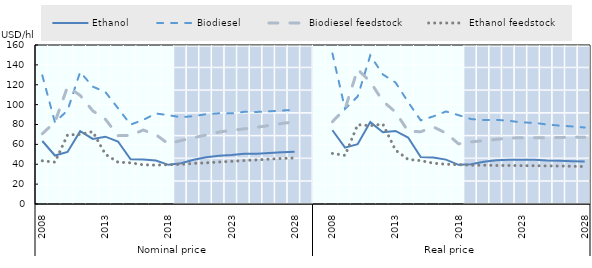
| Category | Projected1 | Projected2 | Projected3 | Projected4 | Projected5 | Projected6 | Projected7 |
|---|---|---|---|---|---|---|---|
| 0 | 0 | 0 | 0 | 0 | 0 | 0 | 0 |
| 1 | 0 | 0 | 0 | 0 | 0 | 0 | 0 |
| 2 | 0 | 0 | 0 | 0 | 0 | 0 | 0 |
| 3 | 0 | 0 | 0 | 0 | 0 | 0 | 0 |
| 4 | 0 | 0 | 0 | 0 | 0 | 0 | 0 |
| 5 | 0 | 0 | 0 | 0 | 0 | 0 | 0 |
| 6 | 0 | 0 | 0 | 0 | 0 | 0 | 0 |
| 7 | 0 | 0 | 0 | 0 | 0 | 0 | 0 |
| 8 | 0 | 0 | 0 | 0 | 0 | 0 | 0 |
| 9 | 0 | 0 | 0 | 0 | 0 | 0 | 0 |
| 10 | 0 | 0 | 0 | 0 | 0 | 0 | 0 |
| 11 | 1 | 1 | 1 | 1 | 1 | 1 | 0.95 |
| 12 | 1 | 1 | 1 | 1 | 1 | 1 | 0.95 |
| 13 | 1 | 1 | 1 | 1 | 1 | 1 | 0.95 |
| 14 | 1 | 1 | 1 | 1 | 1 | 1 | 0.95 |
| 15 | 1 | 1 | 1 | 1 | 1 | 1 | 0.95 |
| 16 | 1 | 1 | 1 | 1 | 1 | 1 | 0.95 |
| 17 | 1 | 1 | 1 | 1 | 1 | 1 | 0.95 |
| 18 | 1 | 1 | 1 | 1 | 1 | 1 | 0.95 |
| 19 | 1 | 1 | 1 | 1 | 1 | 1 | 0.95 |
| 20 | 1 | 1 | 1 | 1 | 1 | 1 | 0.95 |
| 21 | 1 | 1 | 1 | 1 | 1 | 1 | 0.95 |
| 22 | 0 | 0 | 0 | 0 | 0 | 0 | 0 |
| 23 | 0 | 0 | 0 | 0 | 0 | 0 | 0 |
| 24 | 0 | 0 | 0 | 0 | 0 | 0 | 0 |
| 25 | 0 | 0 | 0 | 0 | 0 | 0 | 0 |
| 26 | 0 | 0 | 0 | 0 | 0 | 0 | 0 |
| 27 | 0 | 0 | 0 | 0 | 0 | 0 | 0 |
| 28 | 0 | 0 | 0 | 0 | 0 | 0 | 0 |
| 29 | 0 | 0 | 0 | 0 | 0 | 0 | 0 |
| 30 | 0 | 0 | 0 | 0 | 0 | 0 | 0 |
| 31 | 0 | 0 | 0 | 0 | 0 | 0 | 0 |
| 32 | 0 | 0 | 0 | 0 | 0 | 0 | 0 |
| 33 | 0 | 0 | 0 | 0 | 0 | 0 | 0 |
| 34 | 1 | 1 | 1 | 1 | 1 | 1 | 0.95 |
| 35 | 1 | 1 | 1 | 1 | 1 | 1 | 0.95 |
| 36 | 1 | 1 | 1 | 1 | 1 | 1 | 0.95 |
| 37 | 1 | 1 | 1 | 1 | 1 | 1 | 0.95 |
| 38 | 1 | 1 | 1 | 1 | 1 | 1 | 0.95 |
| 39 | 1 | 1 | 1 | 1 | 1 | 1 | 0.95 |
| 40 | 1 | 1 | 1 | 1 | 1 | 1 | 0.95 |
| 41 | 1 | 1 | 1 | 1 | 1 | 1 | 0.95 |
| 42 | 1 | 1 | 1 | 1 | 1 | 1 | 0.95 |
| 43 | 1 | 1 | 1 | 1 | 1 | 1 | 0.95 |